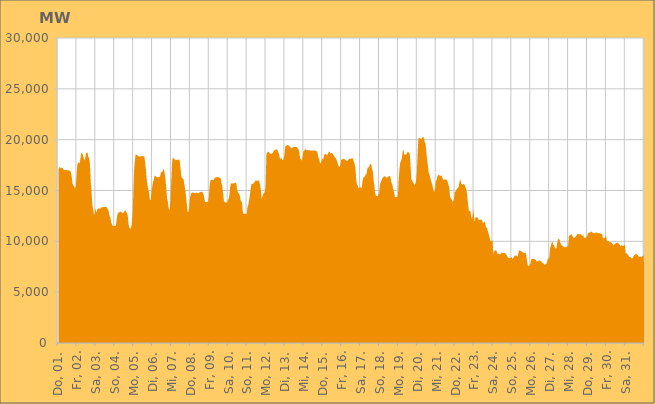
| Category | Series 0 |
|---|---|
|  Do, 01.  | 17054.925 |
|  Do, 01.  | 17265.576 |
|  Do, 01.  | 17314.675 |
|  Do, 01.  | 17160.843 |
|  Do, 01.  | 17231.247 |
|  Do, 01.  | 17250.904 |
|  Do, 01.  | 17124.801 |
|  Do, 01.  | 16980.733 |
|  Do, 01.  | 17015.645 |
|  Do, 01.  | 17032.277 |
|  Do, 01.  | 17007.323 |
|  Do, 01.  | 17053.218 |
|  Do, 01.  | 16950.273 |
|  Do, 01.  | 16986.556 |
|  Do, 01.  | 16930.259 |
|  Do, 01.  | 16946.353 |
|  Do, 01.  | 16750.338 |
|  Fr, 02.  | 16286.66 |
|  Fr, 02.  | 15650.046 |
|  Fr, 02.  | 15467.151 |
|  Fr, 02.  | 15445.269 |
|  Fr, 02.  | 15179.749 |
|  Fr, 02.  | 15361.734 |
|  Fr, 02.  | 16404.543 |
|  Fr, 02.  | 17510.938 |
|  Fr, 02.  | 17736.751 |
|  Fr, 02.  | 17764.939 |
|  Fr, 02.  | 17662.562 |
|  Fr, 02.  | 18171.278 |
|  Fr, 02.  | 18674.94 |
|  Fr, 02.  | 18768.083 |
|  Fr, 02.  | 18494.431 |
|  Fr, 02.  | 18223.256 |
|  Fr, 02.  | 17972.782 |
|  Fr, 02.  | 18158.394 |
|  Fr, 02.  | 18664.991 |
|  Fr, 02.  | 18706.087 |
|  Fr, 02.  | 18704.347 |
|  Fr, 02.  | 18310.292 |
|  Fr, 02.  | 18202.571 |
|  Fr, 02.  | 17604.321 |
|  Sa, 03.  | 15989.653 |
|  Sa, 03.  | 14923.032 |
|  Sa, 03.  | 13656.619 |
|  Sa, 03.  | 13189.893 |
|  Sa, 03.  | 12685.4 |
|  Sa, 03.  | 12605.151 |
|  Sa, 03.  | 13305.146 |
|  Sa, 03.  | 12830.879 |
|  Sa, 03.  | 13048.194 |
|  Sa, 03.  | 13238.369 |
|  Sa, 03.  | 13234.411 |
|  Sa, 03.  | 13241.268 |
|  Sa, 03.  | 13220.136 |
|  Sa, 03.  | 13248.587 |
|  Sa, 03.  | 13348.429 |
|  Sa, 03.  | 13376.193 |
|  Sa, 03.  | 13354.88 |
|  Sa, 03.  | 13378.258 |
|  Sa, 03.  | 13391.492 |
|  Sa, 03.  | 13407.03 |
|  Sa, 03.  | 13368.447 |
|  Sa, 03.  | 13259.033 |
|  Sa, 03.  | 13128.054 |
|  Sa, 03.  | 12897.949 |
|  So, 04.  | 12474.359 |
|  So, 04.  | 12336.202 |
|  So, 04.  | 11808.008 |
|  So, 04.  | 11729.058 |
|  So, 04.  | 11512.252 |
|  So, 04.  | 11519.833 |
|  So, 04.  | 11501.687 |
|  So, 04.  | 11525.262 |
|  So, 04.  | 11566.733 |
|  So, 04.  | 12215.362 |
|  So, 04.  | 12654.743 |
|  So, 04.  | 12813.007 |
|  So, 04.  | 12880.22 |
|  So, 04.  | 12865.133 |
|  So, 04.  | 12948.572 |
|  So, 04.  | 12851.688 |
|  So, 04.  | 12806.592 |
|  So, 04.  | 12789.591 |
|  So, 04.  | 12848.133 |
|  So, 04.  | 13002.344 |
|  So, 04.  | 13066.271 |
|  So, 04.  | 12855.806 |
|  So, 04.  | 12809.68 |
|  So, 04.  | 12534.452 |
|  Mo, 05.  | 11714.69 |
|  Mo, 05.  | 11352.345 |
|  Mo, 05.  | 11264.414 |
|  Mo, 05.  | 11259.369 |
|  Mo, 05.  | 11652.587 |
|  Mo, 05.  | 12497.146 |
|  Mo, 05.  | 14516.724 |
|  Mo, 05.  | 16924.279 |
|  Mo, 05.  | 17904.487 |
|  Mo, 05.  | 18565.29 |
|  Mo, 05.  | 18514.291 |
|  Mo, 05.  | 18471.541 |
|  Mo, 05.  | 18404.686 |
|  Mo, 05.  | 18320.042 |
|  Mo, 05.  | 18348.34 |
|  Mo, 05.  | 18337.521 |
|  Mo, 05.  | 18393.451 |
|  Mo, 05.  | 18358.215 |
|  Mo, 05.  | 18410.045 |
|  Mo, 05.  | 18354.576 |
|  Mo, 05.  | 18388.964 |
|  Mo, 05.  | 17806.905 |
|  Mo, 05.  | 17145.494 |
|  Mo, 05.  | 16137.047 |
|  Di, 06.  | 15548.264 |
|  Di, 06.  | 15114.772 |
|  Di, 06.  | 14823.133 |
|  Di, 06.  | 14109.657 |
|  Di, 06.  | 14011.624 |
|  Di, 06.  | 14730.338 |
|  Di, 06.  | 15322.571 |
|  Di, 06.  | 15834.304 |
|  Di, 06.  | 16053.993 |
|  Di, 06.  | 16453.68 |
|  Di, 06.  | 16435.599 |
|  Di, 06.  | 16368.746 |
|  Di, 06.  | 16344.492 |
|  Di, 06.  | 16309.02 |
|  Di, 06.  | 16305.554 |
|  Di, 06.  | 16344.742 |
|  Di, 06.  | 16351.984 |
|  Di, 06.  | 16789.347 |
|  Di, 06.  | 16814.653 |
|  Di, 06.  | 16851.656 |
|  Di, 06.  | 17055.205 |
|  Di, 06.  | 17059.896 |
|  Di, 06.  | 16658.627 |
|  Di, 06.  | 16064.091 |
|  Mi, 07.  | 15071.808 |
|  Mi, 07.  | 14194.323 |
|  Mi, 07.  | 13828.008 |
|  Mi, 07.  | 13260.53 |
|  Mi, 07.  | 13038.389 |
|  Mi, 07.  | 13749.155 |
|  Mi, 07.  | 15466.285 |
|  Mi, 07.  | 17364.751 |
|  Mi, 07.  | 18228.591 |
|  Mi, 07.  | 18221.589 |
|  Mi, 07.  | 18067.538 |
|  Mi, 07.  | 18061.221 |
|  Mi, 07.  | 17961.937 |
|  Mi, 07.  | 18019.515 |
|  Mi, 07.  | 18016.909 |
|  Mi, 07.  | 18003.311 |
|  Mi, 07.  | 18098.971 |
|  Mi, 07.  | 17918.739 |
|  Mi, 07.  | 17179.543 |
|  Mi, 07.  | 16410.871 |
|  Mi, 07.  | 16201.332 |
|  Mi, 07.  | 16202.484 |
|  Mi, 07.  | 16029.918 |
|  Mi, 07.  | 15528.059 |
|  Do, 08.  | 15048.588 |
|  Do, 08.  | 14433.099 |
|  Do, 08.  | 13661.004 |
|  Do, 08.  | 12903.13 |
|  Do, 08.  | 12881.776 |
|  Do, 08.  | 13421.185 |
|  Do, 08.  | 14273.2 |
|  Do, 08.  | 14639.128 |
|  Do, 08.  | 14776.711 |
|  Do, 08.  | 14813.785 |
|  Do, 08.  | 14792.446 |
|  Do, 08.  | 14757.602 |
|  Do, 08.  | 14767.207 |
|  Do, 08.  | 14757.959 |
|  Do, 08.  | 14793.355 |
|  Do, 08.  | 14792.092 |
|  Do, 08.  | 14719.7 |
|  Do, 08.  | 14751.988 |
|  Do, 08.  | 14794.728 |
|  Do, 08.  | 14862.335 |
|  Do, 08.  | 14862.66 |
|  Do, 08.  | 14894.153 |
|  Do, 08.  | 14811.009 |
|  Do, 08.  | 14636.48 |
|  Fr, 09.  | 14376.428 |
|  Fr, 09.  | 13867.333 |
|  Fr, 09.  | 13879.228 |
|  Fr, 09.  | 13835.049 |
|  Fr, 09.  | 13900.565 |
|  Fr, 09.  | 13903.362 |
|  Fr, 09.  | 14429.57 |
|  Fr, 09.  | 15573.244 |
|  Fr, 09.  | 15984.93 |
|  Fr, 09.  | 16051.861 |
|  Fr, 09.  | 16062.321 |
|  Fr, 09.  | 16038.605 |
|  Fr, 09.  | 16026.696 |
|  Fr, 09.  | 16198.454 |
|  Fr, 09.  | 16266.353 |
|  Fr, 09.  | 16274.426 |
|  Fr, 09.  | 16319.035 |
|  Fr, 09.  | 16333.743 |
|  Fr, 09.  | 16294.28 |
|  Fr, 09.  | 16276.089 |
|  Fr, 09.  | 16232.354 |
|  Fr, 09.  | 16204.359 |
|  Fr, 09.  | 15727.326 |
|  Fr, 09.  | 15396.31 |
|  Sa, 10.  | 14802.77 |
|  Sa, 10.  | 14020.035 |
|  Sa, 10.  | 13877.873 |
|  Sa, 10.  | 13824.973 |
|  Sa, 10.  | 13807.079 |
|  Sa, 10.  | 13804.342 |
|  Sa, 10.  | 14035.108 |
|  Sa, 10.  | 14143.558 |
|  Sa, 10.  | 14536.638 |
|  Sa, 10.  | 15375.845 |
|  Sa, 10.  | 15723.211 |
|  Sa, 10.  | 15687.012 |
|  Sa, 10.  | 15708.128 |
|  Sa, 10.  | 15685.256 |
|  Sa, 10.  | 15736.392 |
|  Sa, 10.  | 15713.455 |
|  Sa, 10.  | 15782.492 |
|  Sa, 10.  | 15599.524 |
|  Sa, 10.  | 14977.531 |
|  Sa, 10.  | 14818.96 |
|  Sa, 10.  | 14709.07 |
|  Sa, 10.  | 14600.547 |
|  Sa, 10.  | 14143.413 |
|  Sa, 10.  | 13907.262 |
|  So, 11.  | 13844.235 |
|  So, 11.  | 12963.314 |
|  So, 11.  | 12677.179 |
|  So, 11.  | 12703.008 |
|  So, 11.  | 12768.255 |
|  So, 11.  | 12684.596 |
|  So, 11.  | 12699.413 |
|  So, 11.  | 13400.559 |
|  So, 11.  | 13591.322 |
|  So, 11.  | 14057.525 |
|  So, 11.  | 14552.633 |
|  So, 11.  | 15159.563 |
|  So, 11.  | 15625.037 |
|  So, 11.  | 15703.137 |
|  So, 11.  | 15624.44 |
|  So, 11.  | 15760.95 |
|  So, 11.  | 15811.527 |
|  So, 11.  | 15987.242 |
|  So, 11.  | 15977.65 |
|  So, 11.  | 15948.476 |
|  So, 11.  | 15986.306 |
|  So, 11.  | 16013.649 |
|  So, 11.  | 15854.89 |
|  So, 11.  | 15538.644 |
|  Mo, 12.  | 14995.436 |
|  Mo, 12.  | 14174.044 |
|  Mo, 12.  | 14419.508 |
|  Mo, 12.  | 14659.713 |
|  Mo, 12.  | 14740.41 |
|  Mo, 12.  | 14847.038 |
|  Mo, 12.  | 15482.003 |
|  Mo, 12.  | 18577.228 |
|  Mo, 12.  | 18716.065 |
|  Mo, 12.  | 18788.304 |
|  Mo, 12.  | 18833.994 |
|  Mo, 12.  | 18672.667 |
|  Mo, 12.  | 18628.41 |
|  Mo, 12.  | 18606.755 |
|  Mo, 12.  | 18625.266 |
|  Mo, 12.  | 18690.109 |
|  Mo, 12.  | 18879.263 |
|  Mo, 12.  | 18930.941 |
|  Mo, 12.  | 19047.419 |
|  Mo, 12.  | 18995.611 |
|  Mo, 12.  | 19066.405 |
|  Mo, 12.  | 18977.95 |
|  Mo, 12.  | 18762.16 |
|  Mo, 12.  | 18629.169 |
|  Di, 13.  | 18192.608 |
|  Di, 13.  | 18061.103 |
|  Di, 13.  | 18242.073 |
|  Di, 13.  | 17999.264 |
|  Di, 13.  | 17988.209 |
|  Di, 13.  | 18142.922 |
|  Di, 13.  | 18588.155 |
|  Di, 13.  | 19360.107 |
|  Di, 13.  | 19386.056 |
|  Di, 13.  | 19429.564 |
|  Di, 13.  | 19469.004 |
|  Di, 13.  | 19445.258 |
|  Di, 13.  | 19422.197 |
|  Di, 13.  | 19249.585 |
|  Di, 13.  | 19252.717 |
|  Di, 13.  | 19137.848 |
|  Di, 13.  | 19198.831 |
|  Di, 13.  | 19253.398 |
|  Di, 13.  | 19345.157 |
|  Di, 13.  | 19276.554 |
|  Di, 13.  | 19274.112 |
|  Di, 13.  | 19283.253 |
|  Di, 13.  | 19264.671 |
|  Di, 13.  | 19096.251 |
|  Mi, 14.  | 19020.383 |
|  Mi, 14.  | 18588.841 |
|  Mi, 14.  | 18136.266 |
|  Mi, 14.  | 18071.329 |
|  Mi, 14.  | 17941.665 |
|  Mi, 14.  | 18350.329 |
|  Mi, 14.  | 18867.557 |
|  Mi, 14.  | 18906.71 |
|  Mi, 14.  | 19044.997 |
|  Mi, 14.  | 19049.918 |
|  Mi, 14.  | 18975.393 |
|  Mi, 14.  | 18995.365 |
|  Mi, 14.  | 18932.609 |
|  Mi, 14.  | 18970.525 |
|  Mi, 14.  | 18953.521 |
|  Mi, 14.  | 18922.794 |
|  Mi, 14.  | 18946.959 |
|  Mi, 14.  | 18938.95 |
|  Mi, 14.  | 18926.572 |
|  Mi, 14.  | 18935.207 |
|  Mi, 14.  | 18961.768 |
|  Mi, 14.  | 18911.659 |
|  Mi, 14.  | 18914.333 |
|  Mi, 14.  | 18833.911 |
|  Do, 15.  | 18650.437 |
|  Do, 15.  | 18214.517 |
|  Do, 15.  | 18138.18 |
|  Do, 15.  | 17658.229 |
|  Do, 15.  | 17722.967 |
|  Do, 15.  | 17891.615 |
|  Do, 15.  | 18200.613 |
|  Do, 15.  | 18022.236 |
|  Do, 15.  | 18338.875 |
|  Do, 15.  | 18618.781 |
|  Do, 15.  | 18573.574 |
|  Do, 15.  | 18565.053 |
|  Do, 15.  | 18443.465 |
|  Do, 15.  | 18616.469 |
|  Do, 15.  | 18818.22 |
|  Do, 15.  | 18818.081 |
|  Do, 15.  | 18648.871 |
|  Do, 15.  | 18679.448 |
|  Do, 15.  | 18680.82 |
|  Do, 15.  | 18622.424 |
|  Do, 15.  | 18503.939 |
|  Do, 15.  | 18425.246 |
|  Do, 15.  | 18218.17 |
|  Do, 15.  | 18202.98 |
|  Fr, 16.  | 17996.908 |
|  Fr, 16.  | 17860.459 |
|  Fr, 16.  | 17515.651 |
|  Fr, 16.  | 17382.698 |
|  Fr, 16.  | 17312.681 |
|  Fr, 16.  | 17524.129 |
|  Fr, 16.  | 18088.695 |
|  Fr, 16.  | 18013.126 |
|  Fr, 16.  | 18116.247 |
|  Fr, 16.  | 18133.652 |
|  Fr, 16.  | 18082.547 |
|  Fr, 16.  | 18015.528 |
|  Fr, 16.  | 17956.432 |
|  Fr, 16.  | 17953.95 |
|  Fr, 16.  | 17929.268 |
|  Fr, 16.  | 18012.841 |
|  Fr, 16.  | 18123.935 |
|  Fr, 16.  | 18111.69 |
|  Fr, 16.  | 18128.713 |
|  Fr, 16.  | 18156.408 |
|  Fr, 16.  | 18178.547 |
|  Fr, 16.  | 18117.252 |
|  Fr, 16.  | 17826.47 |
|  Fr, 16.  | 17596.17 |
|  Sa, 17.  | 17221.44 |
|  Sa, 17.  | 16064.672 |
|  Sa, 17.  | 15553.666 |
|  Sa, 17.  | 15485.347 |
|  Sa, 17.  | 15232.592 |
|  Sa, 17.  | 15244.077 |
|  Sa, 17.  | 15413.913 |
|  Sa, 17.  | 15210.499 |
|  Sa, 17.  | 15289.981 |
|  Sa, 17.  | 15905.007 |
|  Sa, 17.  | 16300.093 |
|  Sa, 17.  | 16284.235 |
|  Sa, 17.  | 16407.242 |
|  Sa, 17.  | 16556.595 |
|  Sa, 17.  | 16617.572 |
|  Sa, 17.  | 17094.968 |
|  Sa, 17.  | 17340.933 |
|  Sa, 17.  | 17238.296 |
|  Sa, 17.  | 17525.739 |
|  Sa, 17.  | 17592.18 |
|  Sa, 17.  | 17646.968 |
|  Sa, 17.  | 17070.973 |
|  Sa, 17.  | 16916.564 |
|  Sa, 17.  | 16018.075 |
|  So, 18.  | 15488.345 |
|  So, 18.  | 14733.047 |
|  So, 18.  | 14489.75 |
|  So, 18.  | 14449.176 |
|  So, 18.  | 14438.714 |
|  So, 18.  | 14563.419 |
|  So, 18.  | 14682.702 |
|  So, 18.  | 15522.477 |
|  So, 18.  | 15809.906 |
|  So, 18.  | 15971.66 |
|  So, 18.  | 16169.255 |
|  So, 18.  | 16285.383 |
|  So, 18.  | 16362.115 |
|  So, 18.  | 16410.207 |
|  So, 18.  | 16358.86 |
|  So, 18.  | 16304.995 |
|  So, 18.  | 16220.124 |
|  So, 18.  | 16331.547 |
|  So, 18.  | 16397.427 |
|  So, 18.  | 16418.288 |
|  So, 18.  | 16439.033 |
|  So, 18.  | 16087.613 |
|  So, 18.  | 15691.362 |
|  So, 18.  | 15538.008 |
|  Mo, 19.  | 15066.651 |
|  Mo, 19.  | 14873.475 |
|  Mo, 19.  | 14369.009 |
|  Mo, 19.  | 14343.795 |
|  Mo, 19.  | 14355.156 |
|  Mo, 19.  | 14328.829 |
|  Mo, 19.  | 14532.263 |
|  Mo, 19.  | 16276.764 |
|  Mo, 19.  | 17209.648 |
|  Mo, 19.  | 17792.639 |
|  Mo, 19.  | 17921.671 |
|  Mo, 19.  | 18223.794 |
|  Mo, 19.  | 18860.275 |
|  Mo, 19.  | 19017.673 |
|  Mo, 19.  | 18553.592 |
|  Mo, 19.  | 18510.924 |
|  Mo, 19.  | 18534.664 |
|  Mo, 19.  | 18559.658 |
|  Mo, 19.  | 18819.839 |
|  Mo, 19.  | 18742.076 |
|  Mo, 19.  | 18758.078 |
|  Mo, 19.  | 18560.605 |
|  Mo, 19.  | 17400.148 |
|  Mo, 19.  | 16104.971 |
|  Di, 20.  | 15996.238 |
|  Di, 20.  | 15782.325 |
|  Di, 20.  | 15690.499 |
|  Di, 20.  | 15550.175 |
|  Di, 20.  | 15642.494 |
|  Di, 20.  | 15949.607 |
|  Di, 20.  | 16901.016 |
|  Di, 20.  | 18792.097 |
|  Di, 20.  | 20194.072 |
|  Di, 20.  | 20143.706 |
|  Di, 20.  | 20126.672 |
|  Di, 20.  | 20100.719 |
|  Di, 20.  | 20096.92 |
|  Di, 20.  | 20235.996 |
|  Di, 20.  | 20226.586 |
|  Di, 20.  | 20180.069 |
|  Di, 20.  | 19714.505 |
|  Di, 20.  | 19681.257 |
|  Di, 20.  | 18771.911 |
|  Di, 20.  | 18057.771 |
|  Di, 20.  | 17402.47 |
|  Di, 20.  | 16731.759 |
|  Di, 20.  | 16548.721 |
|  Di, 20.  | 16246.177 |
|  Mi, 21.  | 15942.278 |
|  Mi, 21.  | 15686.649 |
|  Mi, 21.  | 15410.219 |
|  Mi, 21.  | 14957.768 |
|  Mi, 21.  | 14878.422 |
|  Mi, 21.  | 15121.571 |
|  Mi, 21.  | 15935.679 |
|  Mi, 21.  | 16034.668 |
|  Mi, 21.  | 16388.422 |
|  Mi, 21.  | 16529.207 |
|  Mi, 21.  | 16527.33 |
|  Mi, 21.  | 16462.918 |
|  Mi, 21.  | 16434.587 |
|  Mi, 21.  | 16482.96 |
|  Mi, 21.  | 16330.51 |
|  Mi, 21.  | 16140.605 |
|  Mi, 21.  | 16049.39 |
|  Mi, 21.  | 16082.116 |
|  Mi, 21.  | 16081.736 |
|  Mi, 21.  | 16057.683 |
|  Mi, 21.  | 16045.47 |
|  Mi, 21.  | 15836.576 |
|  Mi, 21.  | 15583.795 |
|  Mi, 21.  | 15307.427 |
|  Do, 22.  | 14407.73 |
|  Do, 22.  | 14230.138 |
|  Do, 22.  | 14150.977 |
|  Do, 22.  | 13933.933 |
|  Do, 22.  | 13895.708 |
|  Do, 22.  | 14130.881 |
|  Do, 22.  | 14903.785 |
|  Do, 22.  | 14844.288 |
|  Do, 22.  | 15100.877 |
|  Do, 22.  | 15158.357 |
|  Do, 22.  | 15249.186 |
|  Do, 22.  | 15381.902 |
|  Do, 22.  | 15814.329 |
|  Do, 22.  | 16157.295 |
|  Do, 22.  | 15720.878 |
|  Do, 22.  | 15655.5 |
|  Do, 22.  | 15545.164 |
|  Do, 22.  | 15650.993 |
|  Do, 22.  | 15597.393 |
|  Do, 22.  | 15478.421 |
|  Do, 22.  | 15262.683 |
|  Do, 22.  | 15054.627 |
|  Do, 22.  | 14357.45 |
|  Do, 22.  | 13628.15 |
|  Fr, 23.  | 12943.4 |
|  Fr, 23.  | 13032.157 |
|  Fr, 23.  | 12962.023 |
|  Fr, 23.  | 12401.923 |
|  Fr, 23.  | 12194.832 |
|  Fr, 23.  | 12645.062 |
|  Fr, 23.  | 13179.976 |
|  Fr, 23.  | 11903.821 |
|  Fr, 23.  | 12286.073 |
|  Fr, 23.  | 12383.104 |
|  Fr, 23.  | 12369.368 |
|  Fr, 23.  | 12341.479 |
|  Fr, 23.  | 12179.323 |
|  Fr, 23.  | 12093.546 |
|  Fr, 23.  | 12120.826 |
|  Fr, 23.  | 12104.14 |
|  Fr, 23.  | 12149.713 |
|  Fr, 23.  | 12020.903 |
|  Fr, 23.  | 11764.13 |
|  Fr, 23.  | 11888.113 |
|  Fr, 23.  | 11940.309 |
|  Fr, 23.  | 11626.924 |
|  Fr, 23.  | 11360.885 |
|  Fr, 23.  | 11327.568 |
|  Sa, 24.  | 11001.772 |
|  Sa, 24.  | 10750.147 |
|  Sa, 24.  | 10508.85 |
|  Sa, 24.  | 10085.8 |
|  Sa, 24.  | 9983.569 |
|  Sa, 24.  | 10087.372 |
|  Sa, 24.  | 10067.151 |
|  Sa, 24.  | 8717.313 |
|  Sa, 24.  | 8982.644 |
|  Sa, 24.  | 9089.945 |
|  Sa, 24.  | 9125.138 |
|  Sa, 24.  | 9065.412 |
|  Sa, 24.  | 8812.681 |
|  Sa, 24.  | 8750.84 |
|  Sa, 24.  | 8814.981 |
|  Sa, 24.  | 8726.772 |
|  Sa, 24.  | 8722.899 |
|  Sa, 24.  | 8824.442 |
|  Sa, 24.  | 8914.559 |
|  Sa, 24.  | 8837.016 |
|  Sa, 24.  | 8858.899 |
|  Sa, 24.  | 8854.717 |
|  Sa, 24.  | 8846.138 |
|  Sa, 24.  | 8745.434 |
|  So, 25.  | 8623.417 |
|  So, 25.  | 8487.855 |
|  So, 25.  | 8361.277 |
|  So, 25.  | 8335.681 |
|  So, 25.  | 8355.176 |
|  So, 25.  | 8383.303 |
|  So, 25.  | 8472.296 |
|  So, 25.  | 8320.393 |
|  So, 25.  | 8303.03 |
|  So, 25.  | 8460.896 |
|  So, 25.  | 8587.534 |
|  So, 25.  | 8591.159 |
|  So, 25.  | 8626.17 |
|  So, 25.  | 8541.529 |
|  So, 25.  | 8511.206 |
|  So, 25.  | 8940.719 |
|  So, 25.  | 9122.625 |
|  So, 25.  | 9070.717 |
|  So, 25.  | 9066.189 |
|  So, 25.  | 9007.59 |
|  So, 25.  | 8917.7 |
|  So, 25.  | 8902.086 |
|  So, 25.  | 8851.433 |
|  So, 25.  | 8869.696 |
|  Mo, 26.  | 8886.28 |
|  Mo, 26.  | 8561.972 |
|  Mo, 26.  | 7923.35 |
|  Mo, 26.  | 7569.122 |
|  Mo, 26.  | 7583.077 |
|  Mo, 26.  | 7682.383 |
|  Mo, 26.  | 7773.384 |
|  Mo, 26.  | 8173.853 |
|  Mo, 26.  | 8269.398 |
|  Mo, 26.  | 8276.892 |
|  Mo, 26.  | 8265.204 |
|  Mo, 26.  | 8235.808 |
|  Mo, 26.  | 8218.293 |
|  Mo, 26.  | 8178.773 |
|  Mo, 26.  | 7991.983 |
|  Mo, 26.  | 8024.197 |
|  Mo, 26.  | 8046.594 |
|  Mo, 26.  | 8096.35 |
|  Mo, 26.  | 8117.432 |
|  Mo, 26.  | 8058.643 |
|  Mo, 26.  | 8019.275 |
|  Mo, 26.  | 7901.351 |
|  Mo, 26.  | 7854.191 |
|  Mo, 26.  | 7784.926 |
|  Di, 27.  | 7680.544 |
|  Di, 27.  | 7742.336 |
|  Di, 27.  | 7740.633 |
|  Di, 27.  | 7933.724 |
|  Di, 27.  | 8254.73 |
|  Di, 27.  | 8283.152 |
|  Di, 27.  | 8370.534 |
|  Di, 27.  | 9336.479 |
|  Di, 27.  | 9554.289 |
|  Di, 27.  | 9865.915 |
|  Di, 27.  | 9994.06 |
|  Di, 27.  | 9666.381 |
|  Di, 27.  | 9631.231 |
|  Di, 27.  | 9381.591 |
|  Di, 27.  | 9288.431 |
|  Di, 27.  | 9334.418 |
|  Di, 27.  | 9795.905 |
|  Di, 27.  | 10157.347 |
|  Di, 27.  | 10231.454 |
|  Di, 27.  | 10171.847 |
|  Di, 27.  | 9852.281 |
|  Di, 27.  | 9703.694 |
|  Di, 27.  | 9627.068 |
|  Di, 27.  | 9524.594 |
|  Mi, 28.  | 9522.225 |
|  Mi, 28.  | 9395.406 |
|  Mi, 28.  | 9431.894 |
|  Mi, 28.  | 9428.219 |
|  Mi, 28.  | 9440.179 |
|  Mi, 28.  | 9528.817 |
|  Mi, 28.  | 9599.989 |
|  Mi, 28.  | 10536.447 |
|  Mi, 28.  | 10584.848 |
|  Mi, 28.  | 10647.339 |
|  Mi, 28.  | 10690.959 |
|  Mi, 28.  | 10598.658 |
|  Mi, 28.  | 10435.613 |
|  Mi, 28.  | 10354.068 |
|  Mi, 28.  | 10365.527 |
|  Mi, 28.  | 10440.379 |
|  Mi, 28.  | 10467.01 |
|  Mi, 28.  | 10692.438 |
|  Mi, 28.  | 10680.233 |
|  Mi, 28.  | 10701.161 |
|  Mi, 28.  | 10683.46 |
|  Mi, 28.  | 10711.966 |
|  Mi, 28.  | 10708.522 |
|  Mi, 28.  | 10583.975 |
|  Do, 29.  | 10533.103 |
|  Do, 29.  | 10642.457 |
|  Do, 29.  | 10375.519 |
|  Do, 29.  | 10333.604 |
|  Do, 29.  | 10361.743 |
|  Do, 29.  | 10420.311 |
|  Do, 29.  | 10494.19 |
|  Do, 29.  | 10806.087 |
|  Do, 29.  | 10851.523 |
|  Do, 29.  | 10869.002 |
|  Do, 29.  | 10879.962 |
|  Do, 29.  | 10949.876 |
|  Do, 29.  | 10940.99 |
|  Do, 29.  | 10856.805 |
|  Do, 29.  | 10835.057 |
|  Do, 29.  | 10778.484 |
|  Do, 29.  | 10843.101 |
|  Do, 29.  | 10854.335 |
|  Do, 29.  | 10860.598 |
|  Do, 29.  | 10847.78 |
|  Do, 29.  | 10807.883 |
|  Do, 29.  | 10757.773 |
|  Do, 29.  | 10825.663 |
|  Do, 29.  | 10755.154 |
|  Fr, 30.  | 10732.269 |
|  Fr, 30.  | 10720.591 |
|  Fr, 30.  | 10313.01 |
|  Fr, 30.  | 10315.686 |
|  Fr, 30.  | 10316.145 |
|  Fr, 30.  | 10414.041 |
|  Fr, 30.  | 10543.482 |
|  Fr, 30.  | 10077.735 |
|  Fr, 30.  | 10055.828 |
|  Fr, 30.  | 10025.663 |
|  Fr, 30.  | 9975.652 |
|  Fr, 30.  | 9869.424 |
|  Fr, 30.  | 9929.463 |
|  Fr, 30.  | 9865.645 |
|  Fr, 30.  | 9767.962 |
|  Fr, 30.  | 9661.385 |
|  Fr, 30.  | 9624.761 |
|  Fr, 30.  | 9737.903 |
|  Fr, 30.  | 9787.422 |
|  Fr, 30.  | 9825.311 |
|  Fr, 30.  | 9856.284 |
|  Fr, 30.  | 9849.88 |
|  Fr, 30.  | 9791.364 |
|  Fr, 30.  | 9701.287 |
|  Sa, 31.  | 9580.495 |
|  Sa, 31.  | 9550.949 |
|  Sa, 31.  | 9620.676 |
|  Sa, 31.  | 9550.868 |
|  Sa, 31.  | 9560.119 |
|  Sa, 31.  | 9587.014 |
|  Sa, 31.  | 9700.796 |
|  Sa, 31.  | 8787.795 |
|  Sa, 31.  | 8841.324 |
|  Sa, 31.  | 8774.086 |
|  Sa, 31.  | 8664.02 |
|  Sa, 31.  | 8515.049 |
|  Sa, 31.  | 8463.642 |
|  Sa, 31.  | 8457.383 |
|  Sa, 31.  | 8379.343 |
|  Sa, 31.  | 8311.013 |
|  Sa, 31.  | 8367.168 |
|  Sa, 31.  | 8522.417 |
|  Sa, 31.  | 8643.289 |
|  Sa, 31.  | 8721.491 |
|  Sa, 31.  | 8746.327 |
|  Sa, 31.  | 8736.91 |
|  Sa, 31.  | 8650.61 |
|  Sa, 31.  | 8536.057 |
|  So, 01.  | 8488.648 |
|  So, 01.  | 8469.012 |
|  So, 01.  | 8479.85 |
|  So, 01.  | 8457.895 |
|  So, 01.  | 8528 |
|  So, 01.  | 8579.082 |
|    | 8639.691 |